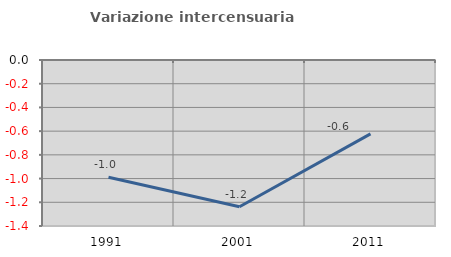
| Category | Variazione intercensuaria annua |
|---|---|
| 1991.0 | -0.988 |
| 2001.0 | -1.237 |
| 2011.0 | -0.623 |